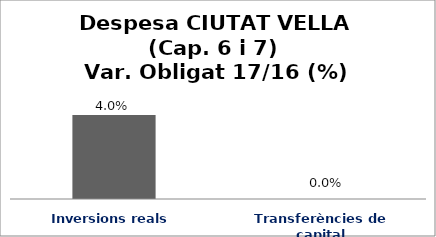
| Category | Series 0 |
|---|---|
| Inversions reals | 0.04 |
| Transferències de capital | 0 |